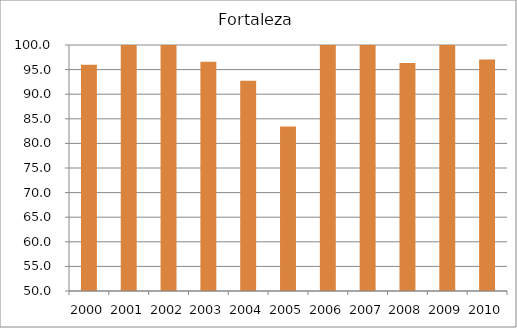
| Category | Fortaleza |
|---|---|
| 2000.0 | 95.98 |
| 2001.0 | 104.92 |
| 2002.0 | 103.65 |
| 2003.0 | 96.61 |
| 2004.0 | 92.75 |
| 2005.0 | 83.43 |
| 2006.0 | 106.73 |
| 2007.0 | 103.15 |
| 2008.0 | 96.32 |
| 2009.0 | 101.38 |
| 2010.0 | 97.07 |